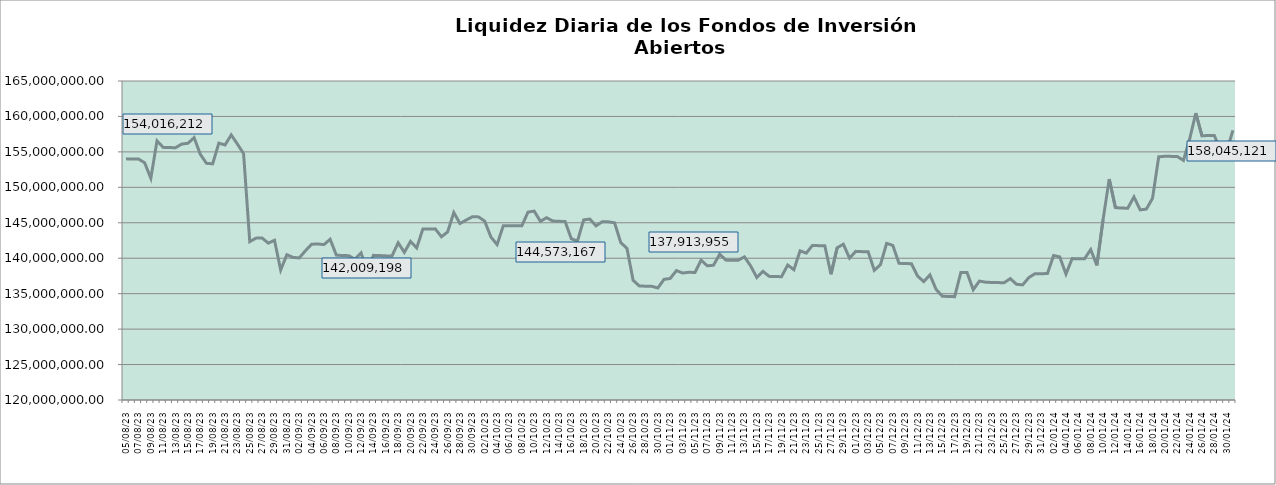
| Category | Series 0 |
|---|---|
| 2023-08-05 | 154016212.26 |
| 2023-08-06 | 153998460.63 |
| 2023-08-07 | 154003206.59 |
| 2023-08-08 | 153463617.9 |
| 2023-08-09 | 151275983.56 |
| 2023-08-10 | 156557558.49 |
| 2023-08-11 | 155636284.33 |
| 2023-08-12 | 155608232.68 |
| 2023-08-13 | 155591304.7 |
| 2023-08-14 | 156102039.43 |
| 2023-08-15 | 156215343.69 |
| 2023-08-16 | 157010791.53 |
| 2023-08-17 | 154663923.56 |
| 2023-08-18 | 153387856.69 |
| 2023-08-19 | 153314384.31 |
| 2023-08-20 | 156238403.63 |
| 2023-08-21 | 155974720.3 |
| 2023-08-22 | 157393571.5 |
| 2023-08-23 | 156108673.19 |
| 2023-08-24 | 154755827.71 |
| 2023-08-25 | 142339483.8 |
| 2023-08-26 | 142834309.99 |
| 2023-08-27 | 142845396.95 |
| 2023-08-28 | 142129776.63 |
| 2023-08-29 | 142531080.68 |
| 2023-08-30 | 138332190.43 |
| 2023-08-31 | 140499354.46 |
| 2023-09-01 | 140113844.55 |
| 2023-09-02 | 140040873.36 |
| 2023-09-03 | 141051534.51 |
| 2023-09-04 | 141972949.27 |
| 2023-09-05 | 142009197.97 |
| 2023-09-06 | 141922684.19 |
| 2023-09-07 | 142673507.27 |
| 2023-09-08 | 140438336.78 |
| 2023-09-09 | 140378215.04 |
| 2023-09-10 | 140361923.22 |
| 2023-09-11 | 139856330.14 |
| 2023-09-12 | 140755982.43 |
| 2023-09-13 | 138209202.99 |
| 2023-09-14 | 140406022.18 |
| 2023-09-15 | 140376158.96 |
| 2023-09-16 | 140330901.12 |
| 2023-09-17 | 140314549.63 |
| 2023-09-18 | 142177404.36 |
| 2023-09-19 | 140828745.8 |
| 2023-09-20 | 142369430.66 |
| 2023-09-21 | 141452067.91 |
| 2023-09-22 | 144137154.56 |
| 2023-09-23 | 144129136.77 |
| 2023-09-24 | 144140355.03 |
| 2023-09-25 | 143030464.27 |
| 2023-09-26 | 143709526.36 |
| 2023-09-27 | 146442364.41 |
| 2023-09-28 | 144898523.31 |
| 2023-09-29 | 145379884.37 |
| 2023-09-30 | 145846882.75 |
| 2023-10-01 | 145830662.65 |
| 2023-10-02 | 145223175.32 |
| 2023-10-03 | 142991442.49 |
| 2023-10-04 | 141928458.32 |
| 2023-10-05 | 144573166.98 |
| 2023-10-06 | 144583837.61 |
| 2023-10-07 | 144582102.2 |
| 2023-10-08 | 144565903.72 |
| 2023-10-09 | 146507830.64 |
| 2023-10-10 | 146644547.24 |
| 2023-10-11 | 145204706.32 |
| 2023-10-12 | 145714461.06 |
| 2023-10-13 | 145254587.01 |
| 2023-10-14 | 145202166.02 |
| 2023-10-15 | 145186093.08 |
| 2023-10-16 | 142751003.88 |
| 2023-10-17 | 142420672.04 |
| 2023-10-18 | 145405968.76 |
| 2023-10-19 | 145524125.21 |
| 2023-10-20 | 144561548.62 |
| 2023-10-21 | 145143976.13 |
| 2023-10-22 | 145127840.58 |
| 2023-10-23 | 144997720.04 |
| 2023-10-24 | 142203772.79 |
| 2023-10-25 | 141394025.65 |
| 2023-10-26 | 136882533.54 |
| 2023-10-27 | 136093760.43 |
| 2023-10-28 | 136053297.06 |
| 2023-10-29 | 136037251.76 |
| 2023-10-30 | 135806534.56 |
| 2023-10-31 | 137019231.3 |
| 2023-11-01 | 137147206.26 |
| 2023-11-02 | 138254975.75 |
| 2023-11-03 | 137913954.8 |
| 2023-11-04 | 138011079.26 |
| 2023-11-05 | 137994487.41 |
| 2023-11-06 | 139720529.84 |
| 2023-11-07 | 138924336.01 |
| 2023-11-08 | 139010487.17 |
| 2023-11-09 | 140567934.86 |
| 2023-11-10 | 139735186.73 |
| 2023-11-11 | 139704201.44 |
| 2023-11-12 | 139724220.24 |
| 2023-11-13 | 140191854.27 |
| 2023-11-14 | 138926827.83 |
| 2023-11-15 | 137282270.7 |
| 2023-11-16 | 138142908.64 |
| 2023-11-17 | 137442252.96 |
| 2023-11-18 | 137413552.22 |
| 2023-11-19 | 137396889.14 |
| 2023-11-20 | 139040160.06 |
| 2023-11-21 | 138377572.06 |
| 2023-11-22 | 141043509.51 |
| 2023-11-23 | 140715103.37 |
| 2023-11-24 | 141802145.8 |
| 2023-11-25 | 141773249.11 |
| 2023-11-26 | 141757089.47 |
| 2023-11-27 | 137732526.98 |
| 2023-11-28 | 141477123.64 |
| 2023-11-29 | 141974288.97 |
| 2023-11-30 | 140007766.06 |
| 2023-12-01 | 140969519.96 |
| 2023-12-02 | 140928876.61 |
| 2023-12-03 | 140924197.91 |
| 2023-12-04 | 138292399.49 |
| 2023-12-05 | 139089517.65 |
| 2023-12-06 | 142102693.83 |
| 2023-12-07 | 141800672 |
| 2023-12-08 | 139282023.73 |
| 2023-12-09 | 139246490.36 |
| 2023-12-10 | 139230564.54 |
| 2023-12-11 | 137493593.8 |
| 2023-12-12 | 136695207.53 |
| 2023-12-13 | 137647237.96 |
| 2023-12-14 | 135599730.29 |
| 2023-12-15 | 134642918.31 |
| 2023-12-16 | 134594915.42 |
| 2023-12-17 | 134579064.34 |
| 2023-12-18 | 137987669.72 |
| 2023-12-19 | 137995732.42 |
| 2023-12-20 | 135553853.22 |
| 2023-12-21 | 136775176.52 |
| 2023-12-22 | 136623688.08 |
| 2023-12-23 | 136576769.35 |
| 2023-12-24 | 136561308.93 |
| 2023-12-25 | 136545464.64 |
| 2023-12-26 | 137126168.27 |
| 2023-12-27 | 136322562.51 |
| 2023-12-28 | 136241651.59 |
| 2023-12-29 | 137274974.11 |
| 2023-12-30 | 137825488.4 |
| 2023-12-31 | 137821222.69 |
| 2024-01-01 | 137831671.6 |
| 2024-01-02 | 140385040.98 |
| 2024-01-03 | 140181057.05 |
| 2024-01-04 | 137765328.28 |
| 2024-01-05 | 139949724.17 |
| 2024-01-06 | 139910516.55 |
| 2024-01-07 | 139918805.07 |
| 2024-01-08 | 141219963.12 |
| 2024-01-09 | 138987705.6 |
| 2024-01-10 | 145450284.04 |
| 2024-01-11 | 151162434.4 |
| 2024-01-12 | 147142729.73 |
| 2024-01-13 | 147072311.51 |
| 2024-01-14 | 147060778.98 |
| 2024-01-15 | 148647789.9 |
| 2024-01-16 | 146820875.14 |
| 2024-01-17 | 146929689.71 |
| 2024-01-18 | 148450891.81 |
| 2024-01-19 | 154304841.31 |
| 2024-01-20 | 154379818.66 |
| 2024-01-21 | 154366847.09 |
| 2024-01-22 | 154350922.16 |
| 2024-01-23 | 153798957.97 |
| 2024-01-24 | 156795317.88 |
| 2024-01-25 | 160465376.32 |
| 2024-01-26 | 157258481.1 |
| 2024-01-27 | 157318070.05 |
| 2024-01-28 | 157302360.63 |
| 2024-01-29 | 155177392.89 |
| 2024-01-30 | 155089695.68 |
| 2024-01-31 | 158045121.35 |